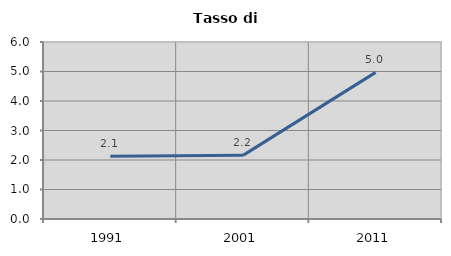
| Category | Tasso di disoccupazione   |
|---|---|
| 1991.0 | 2.128 |
| 2001.0 | 2.157 |
| 2011.0 | 4.971 |